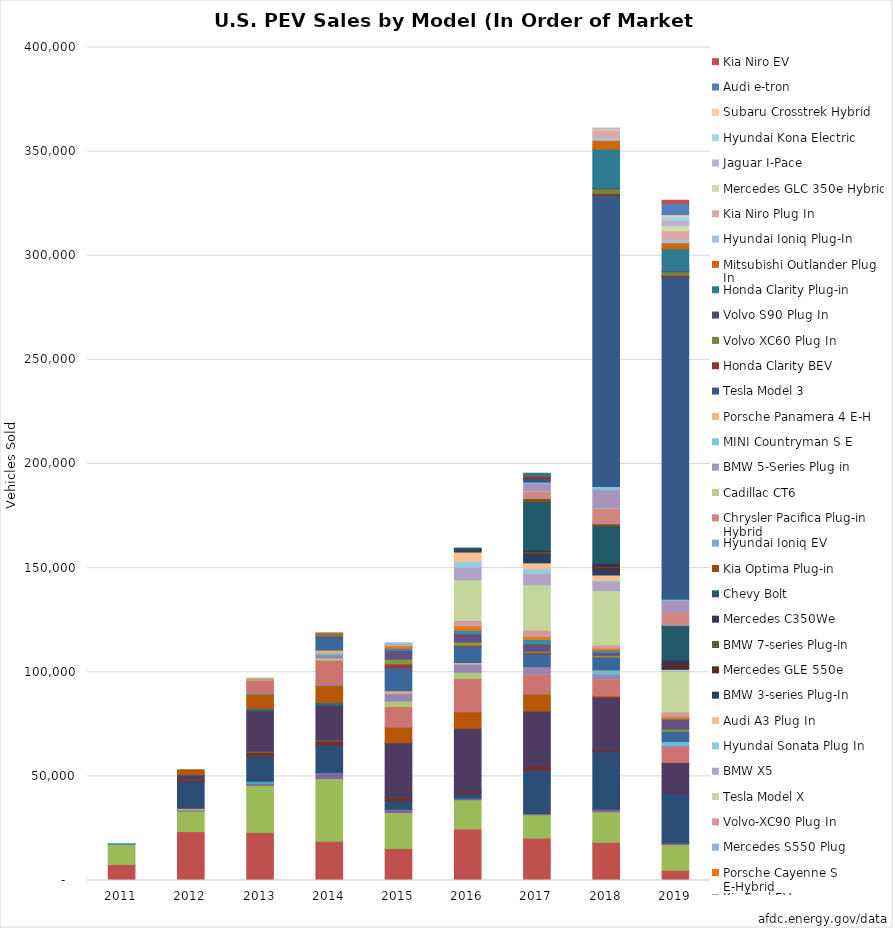
| Category | Chevy Volt | Nissan Leaf | Smart ED | Mitsubishi I EV | BMW Active E | Prius PHEV | Ford Focus EV | Honda Fit EV | Tesla Model S | Toyota RAV4 EV | Ford C-Max Energi | Honda Accord | Ford Fusion Energi | Chevy Spark | Fiat 500E | Porsche Panamera S E-Hybrid | Cadillac ELR | BMW i3 | Mercedes B-Class (B250e) | BMW i8 | VW e-Golf | Kia Soul EV | Porsche Cayenne S E-Hybrid | Mercedes S550 Plug | Volvo-XC90 Plug In | Tesla Model X | BMW X5 | Hyundai Sonata Plug In | Audi A3 Plug In | BMW 3-series Plug-In | Mercedes GLE 550e | BMW 7-series Plug-in | Mercedes C350We | Chevy Bolt | Kia Optima Plug-in | Hyundai Ioniq EV | Chrysler Pacifica Plug-in Hybrid | Cadillac CT6 | BMW 5-Series Plug in | MINI Countryman S E | Porsche Panamera 4 E-H | Tesla Model 3 | Honda Clarity BEV | Volvo XC60 Plug In | Volvo S90 Plug In | Honda Clarity Plug-in | Mitsubishi Outlander Plug In | Hyundai Ioniq Plug-In | Kia Niro Plug In | Mercedes GLC 350e Hybrid | Jaguar I-Pace | Hyundai Kona Electric | Subaru Crosstrek Hybrid | Audi e-tron | Kia Niro EV |
|---|---|---|---|---|---|---|---|---|---|---|---|---|---|---|---|---|---|---|---|---|---|---|---|---|---|---|---|---|---|---|---|---|---|---|---|---|---|---|---|---|---|---|---|---|---|---|---|---|---|---|---|---|---|---|---|
| 2011.0 | 7671 | 9674 | 342 | 76 | 0 | 0 | 0 | 0 | 0 | 0 | 0 | 0 | 0 | 0 | 0 | 0 | 0 | 0 | 0 | 0 | 0 | 0 | 0 | 0 | 0 | 0 | 0 | 0 | 0 | 0 | 0 | 0 | 0 | 0 | 0 | 0 | 0 | 0 | 0 | 0 | 0 | 0 | 0 | 0 | 0 | 0 | 0 | 0 | 0 | 0 | 0 | 0 | 0 | 0 | 0 |
| 2012.0 | 23461 | 9819 | 139 | 588 | 673 | 12749 | 683 | 93 | 2400 | 192 | 2374 | 0 | 0 | 0 | 0 | 0 | 0 | 0 | 0 | 0 | 0 | 0 | 0 | 0 | 0 | 0 | 0 | 0 | 0 | 0 | 0 | 0 | 0 | 0 | 0 | 0 | 0 | 0 | 0 | 0 | 0 | 0 | 0 | 0 | 0 | 0 | 0 | 0 | 0 | 0 | 0 | 0 | 0 | 0 | 0 |
| 2013.0 | 23094 | 22610 | 923 | 1029 | 0 | 12088 | 1738 | 569 | 19400 | 1005 | 7154 | 526 | 6089 | 560 | 260 | 51 | 6 | 0 | 0 | 0 | 0 | 0 | 0 | 0 | 0 | 0 | 0 | 0 | 0 | 0 | 0 | 0 | 0 | 0 | 0 | 0 | 0 | 0 | 0 | 0 | 0 | 0 | 0 | 0 | 0 | 0 | 0 | 0 | 0 | 0 | 0 | 0 | 0 | 0 | 0 |
| 2014.0 | 18805 | 30200 | 2594 | 196 | 0 | 13264 | 1964 | 407 | 16750 | 1184 | 8433 | 449 | 11550 | 1145 | 1503 | 879 | 1310 | 6092 | 774 | 555 | 357 | 359 | 112 | 0 | 0 | 0 | 0 | 0 | 0 | 0 | 0 | 0 | 0 | 0 | 0 | 0 | 0 | 0 | 0 | 0 | 0 | 0 | 0 | 0 | 0 | 0 | 0 | 0 | 0 | 0 | 0 | 0 | 0 | 0 | 0 |
| 2015.0 | 15393 | 17269 | 1387 | 115 | 0 | 4191 | 1582 | 2 | 26200 | 18 | 7591 | 64 | 9750 | 2629 | 3477 | 407 | 1024 | 11024 | 1906 | 2265 | 4232 | 1015 | 1163 | 118 | 86 | 208 | 892 | 15 | 0 | 0 | 0 | 0 | 0 | 0 | 0 | 0 | 0 | 0 | 0 | 0 | 0 | 0 | 0 | 0 | 0 | 0 | 0 | 0 | 0 | 0 | 0 | 0 | 0 | 0 | 0 |
| 2016.0 | 24739 | 14006 | 657 | 94 | 0 | 2474 | 901 | 0 | 30200 | 0 | 7957 | 0 | 15938 | 3035 | 3737 | 393 | 534 | 7625 | 632 | 1594 | 3937 | 1728 | 2111 | 550 | 2015 | 19600 | 5995 | 3000 | 4280 | 880 | 231 | 23 | 171 | 579 | 0 | 0 | 0 | 0 | 0 | 0 | 0 | 0 | 0 | 0 | 0 | 0 | 0 | 0 | 0 | 0 | 0 | 0 | 0 | 0 | 0 |
| 2017.0 | 20349 | 11230 | 544 | 6 | 0 | 20936 | 1817 | 0 | 26500 | 0 | 8140 | 0 | 9632 | 23 | 3336 | 18 | 17 | 6276 | 744 | 488 | 3534 | 2157 | 1574 | 666 | 2358 | 21700 | 5349 | 2254 | 2877 | 4141 | 463 | 707 | 817 | 23297 | 1512 | 432 | 2981 | 205 | 3759 | 475 | 0 | 1770 | 1126 | 356 | 112 | 903 | 0 | 0 | 0 | 0 | 0 | 0 | 0 | 0 | 0 |
| 2018.0 | 18306 | 14715 | 1219 | 0 | 0 | 27595 | 560 | 0 | 25745 | 0 | 582 | 0 | 8074 | 7 | 2250 | 2036 | 1 | 6117 | 135 | 772 | 1354 | 1134 | 1022 | 96 | 1387 | 26100 | 4434 | 460 | 2597 | 2600 | 966 | 339 | 1721 | 18019 | 965 | 345 | 7062 | 231 | 8664 | 1564 | 0 | 139782 | 948 | 2267 | 437 | 18602 | 4166 | 1590 | 3389 | 567 | 393 | 0 | 0 | 0 | 0 |
| 2019.0 | 4915 | 12365 | 680 | 0 | 0 | 23630 | 0 | 0 | 15090 | 0 | 0 | 0 | 7476 | 0 | 632 | 1958 | 0 | 4854 | 9 | 1102 | 4863 | 114 | 1140 | 371 | 1710 | 19425 | 167 | 456 | 437 | 705 | 1509 | 80 | 2172 | 16313 | 350 | 739 | 5811 | 25 | 5442 | 494 | 0 | 154840 | 742 | 1682 | 407 | 10728 | 2810 | 1765 | 4051 | 2459 | 2594 | 1721 | 880 | 5369 | 1562 |